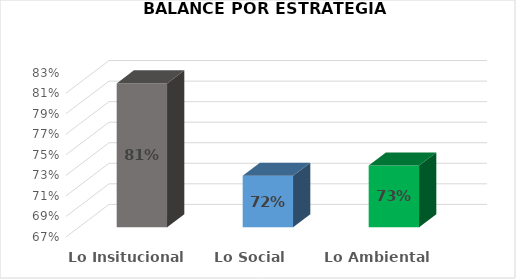
| Category | Series 0 |
|---|---|
| Lo Insitucional | 0.81 |
| Lo Social  | 0.72 |
| Lo Ambiental  | 0.73 |